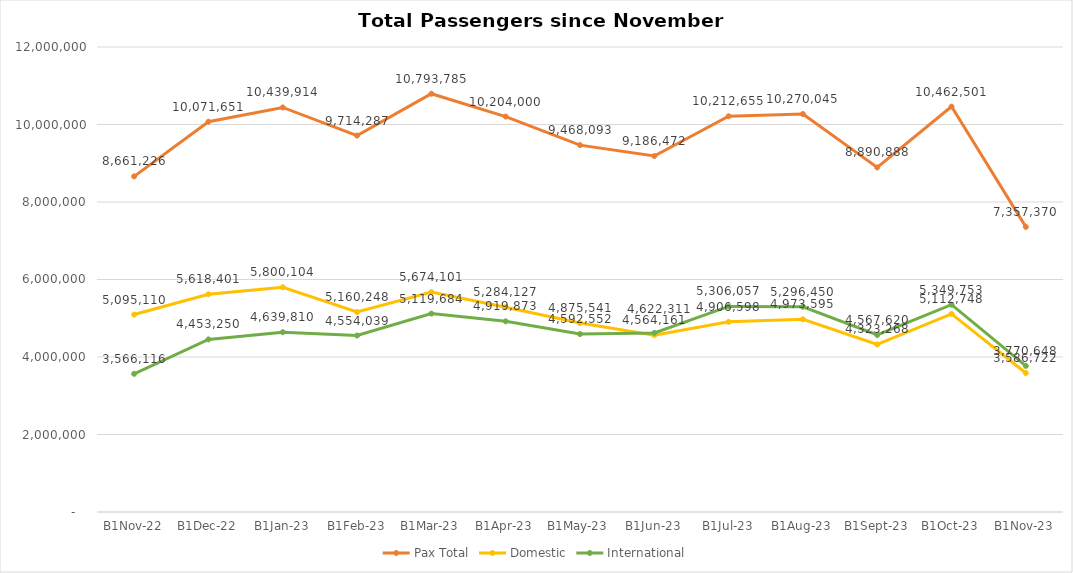
| Category | Pax Total | Domestic | International |
|---|---|---|---|
| 2022-11-01 | 8661226 | 5095110 | 3566116 |
| 2022-12-01 | 10071651 | 5618401 | 4453250 |
| 2023-01-01 | 10439914 | 5800104 | 4639810 |
| 2023-02-01 | 9714287 | 5160248 | 4554039 |
| 2023-03-01 | 10793785 | 5674101 | 5119684 |
| 2023-04-01 | 10204000 | 5284127 | 4919873 |
| 2023-05-01 | 9468093 | 4875541 | 4592552 |
| 2023-06-01 | 9186472 | 4564161 | 4622311 |
| 2023-07-01 | 10212655 | 4906598 | 5306057 |
| 2023-08-01 | 10270045 | 4973595 | 5296450 |
| 2023-09-01 | 8890888 | 4323268 | 4567620 |
| 2023-10-01 | 10462501 | 5112748 | 5349753 |
| 2023-11-01 | 7357370 | 3586722 | 3770648 |